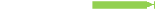
| Category | Reduces the load on other services (email, ...) |
|---|---|
| Reduces the load on other services (email, ...) | 2 |